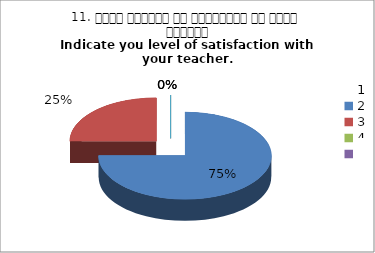
| Category | 11. अपने शिक्षक से संतुष्टि का स्तर बताइये
Indicate you level of satisfaction with your teacher.
 |
|---|---|
| 0 | 3 |
| 1 | 1 |
| 2 | 0 |
| 3 | 0 |
| 4 | 0 |